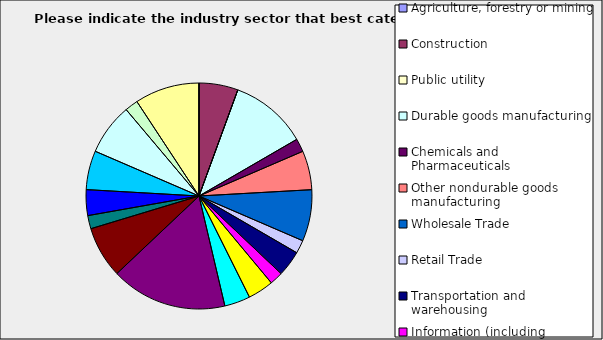
| Category | Series 0 |
|---|---|
| Agriculture, forestry or mining | 0 |
| Construction | 0.056 |
| Public utility | 0 |
| Durable goods manufacturing | 0.111 |
| Chemicals and Pharmaceuticals | 0.019 |
| Other nondurable goods manufacturing | 0.056 |
| Wholesale Trade | 0.074 |
| Retail Trade | 0.019 |
| Transportation and warehousing | 0.037 |
| Information (including broadcasting and telecommunication) | 0.019 |
| Finance and Insurance | 0.037 |
| Real Estate | 0.037 |
| Professional, scientific and technical services | 0.167 |
| Consulting | 0.074 |
| Administrative and office services (including waste management) | 0.019 |
| Education | 0.037 |
| Health Care and social services | 0.056 |
| Arts, entertainment and recreation | 0.074 |
| Accommodation and food services | 0.019 |
| Other | 0.093 |